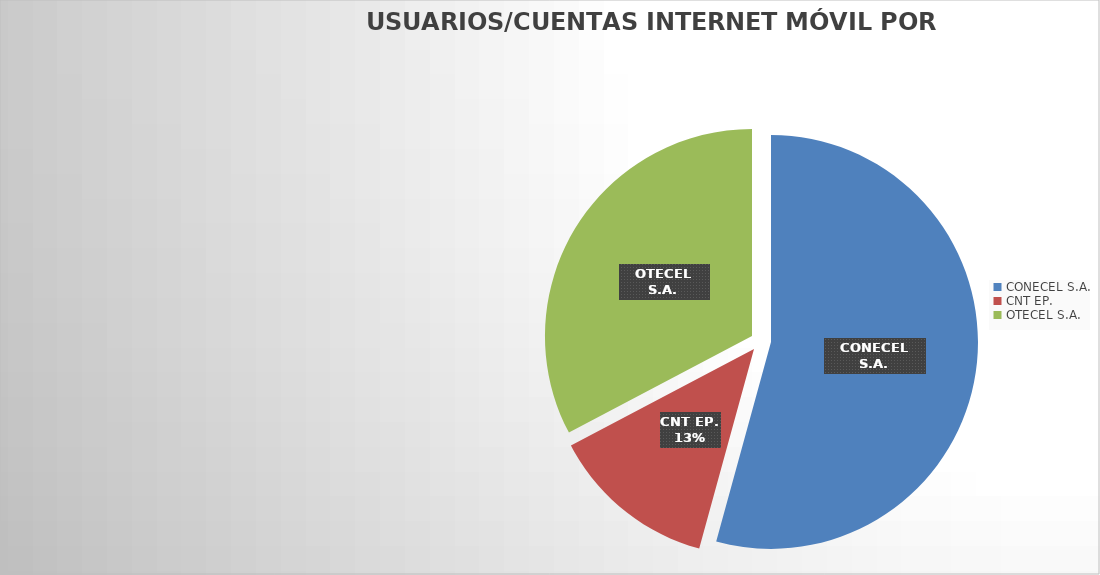
| Category | Series 0 |
|---|---|
| CONECEL S.A. | 4835048 |
| CNT EP. | 1158829 |
| OTECEL S.A. | 2916198 |